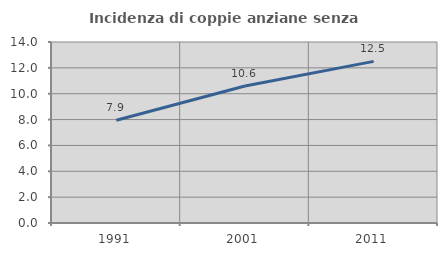
| Category | Incidenza di coppie anziane senza figli  |
|---|---|
| 1991.0 | 7.947 |
| 2001.0 | 10.596 |
| 2011.0 | 12.5 |